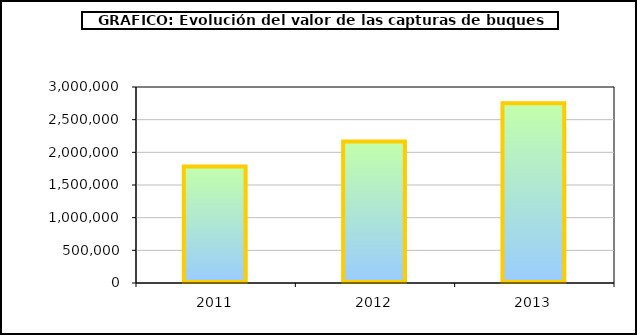
| Category | Series 0 |
|---|---|
| 0 | 1784430.541 |
| 1 | 2165361.923 |
| 2 | 2750204.662 |